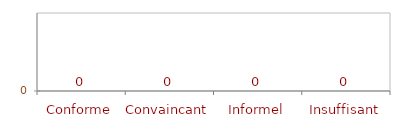
| Category | Conforme |
|---|---|
| Conforme | 0 |
| Convaincant | 0 |
| Informel | 0 |
| Insuffisant | 0 |